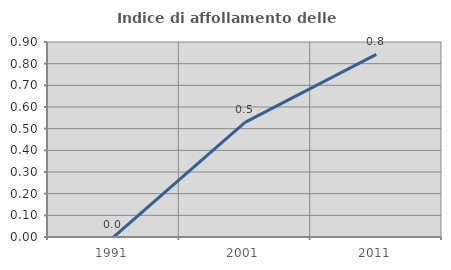
| Category | Indice di affollamento delle abitazioni  |
|---|---|
| 1991.0 | 0 |
| 2001.0 | 0.529 |
| 2011.0 | 0.843 |